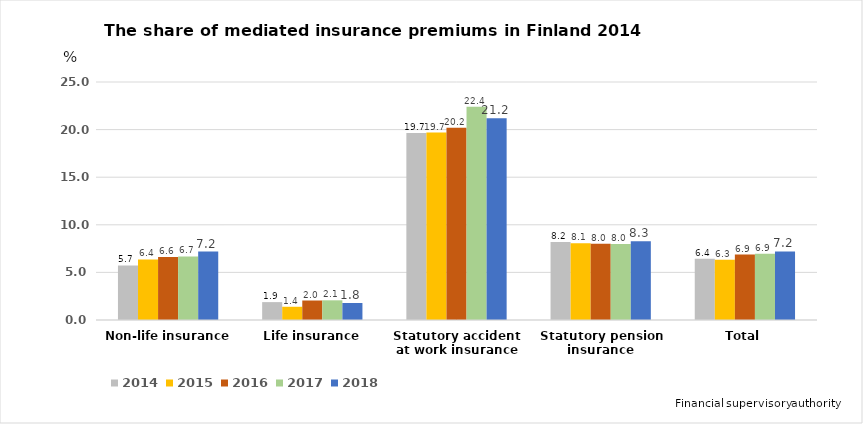
| Category | 2014 | 2015 | 2016 | 2017 | 2018 |
|---|---|---|---|---|---|
| Non-life insurance | 5.737 | 6.356 | 6.621 | 6.681 | 7.184 |
| Life insurance | 1.88 | 1.39 | 2.047 | 2.067 | 1.786 |
| Statutory accident at work insurance | 19.654 | 19.692 | 20.194 | 22.408 | 21.186 |
| Statutory pension insurance | 8.203 | 8.075 | 8.016 | 7.982 | 8.268 |
| Total | 6.436 | 6.337 | 6.875 | 6.948 | 7.208 |